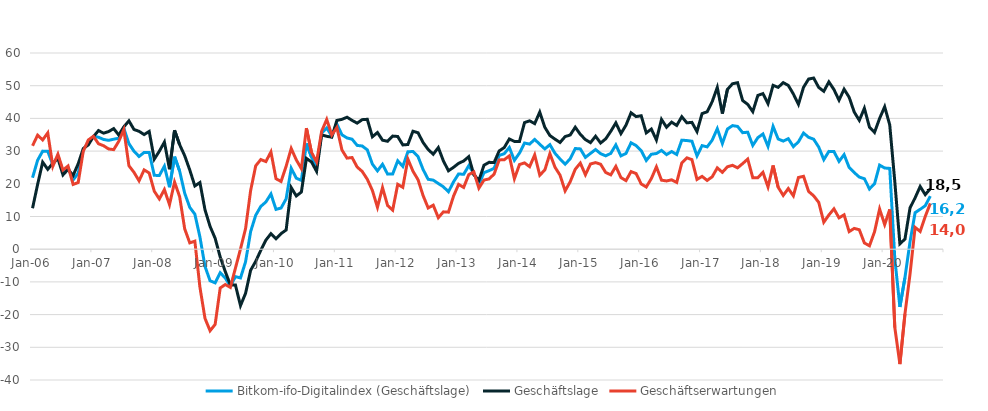
| Category | Bitkom-ifo-Digitalindex (Geschäftslage) | Geschäftslage | Geschäftserwartungen |
|---|---|---|---|
| 2006-01-01 | 21.86 | 12.52 | 31.62 |
| 2006-02-01 | 27.21 | 19.8 | 34.87 |
| 2006-03-01 | 29.99 | 26.62 | 33.42 |
| 2006-04-01 | 29.93 | 24.43 | 35.57 |
| 2006-05-01 | 25.82 | 26.28 | 25.37 |
| 2006-06-01 | 28.41 | 27.78 | 29.05 |
| 2006-07-01 | 23.46 | 22.72 | 24.2 |
| 2006-08-01 | 24.92 | 24.41 | 25.44 |
| 2006-09-01 | 21.18 | 22.55 | 19.81 |
| 2006-10-01 | 23.24 | 26.13 | 20.38 |
| 2006-11-01 | 30.38 | 30.78 | 29.97 |
| 2006-12-01 | 32.66 | 31.9 | 33.41 |
| 2007-01-01 | 34.48 | 34.43 | 34.53 |
| 2007-02-01 | 34.25 | 36.27 | 32.25 |
| 2007-03-01 | 33.56 | 35.49 | 31.65 |
| 2007-04-01 | 33.29 | 35.97 | 30.65 |
| 2007-05-01 | 33.64 | 36.88 | 30.45 |
| 2007-06-01 | 33.95 | 34.91 | 32.99 |
| 2007-07-01 | 37 | 37.42 | 36.57 |
| 2007-08-01 | 32.29 | 39.25 | 25.53 |
| 2007-09-01 | 29.96 | 36.61 | 23.51 |
| 2007-10-01 | 28.36 | 36.05 | 20.91 |
| 2007-11-01 | 29.59 | 35.06 | 24.25 |
| 2007-12-01 | 29.58 | 36.02 | 23.31 |
| 2008-01-01 | 22.59 | 27.53 | 17.75 |
| 2008-02-01 | 22.55 | 29.97 | 15.37 |
| 2008-03-01 | 25.39 | 32.76 | 18.25 |
| 2008-04-01 | 18.97 | 24.47 | 13.61 |
| 2008-05-01 | 28.3 | 36.35 | 20.52 |
| 2008-06-01 | 23.89 | 31.98 | 16.08 |
| 2008-07-01 | 17.11 | 28.58 | 6.21 |
| 2008-08-01 | 12.79 | 24.22 | 1.94 |
| 2008-09-01 | 10.72 | 19.34 | 2.45 |
| 2008-10-01 | 3.76 | 20.39 | -11.61 |
| 2008-11-01 | -5.25 | 12.06 | -21.15 |
| 2008-12-01 | -9.65 | 6.98 | -24.94 |
| 2009-01-01 | -10.29 | 3.34 | -23.01 |
| 2009-02-01 | -7.18 | -2.39 | -11.87 |
| 2009-03-01 | -8.83 | -6.84 | -10.8 |
| 2009-04-01 | -11.29 | -10.91 | -11.68 |
| 2009-05-01 | -8.39 | -10.94 | -5.8 |
| 2009-06-01 | -8.79 | -17.26 | 0.07 |
| 2009-07-01 | -3.85 | -13.49 | 6.29 |
| 2009-08-01 | 5.4 | -6.43 | 17.96 |
| 2009-09-01 | 10.38 | -3.71 | 25.49 |
| 2009-10-01 | 13.08 | -0.36 | 27.42 |
| 2009-11-01 | 14.44 | 2.77 | 26.79 |
| 2009-12-01 | 16.89 | 4.75 | 29.75 |
| 2010-01-01 | 12.18 | 3.21 | 21.55 |
| 2010-02-01 | 12.59 | 4.78 | 20.71 |
| 2010-03-01 | 15.41 | 5.87 | 25.39 |
| 2010-04-01 | 24.74 | 18.84 | 30.8 |
| 2010-05-01 | 21.73 | 16.28 | 27.32 |
| 2010-06-01 | 21.04 | 17.48 | 24.66 |
| 2010-07-01 | 32.34 | 27.77 | 37.01 |
| 2010-08-01 | 28.15 | 26.68 | 29.63 |
| 2010-09-01 | 25.25 | 23.81 | 26.7 |
| 2010-10-01 | 35.51 | 34.95 | 36.08 |
| 2010-11-01 | 37.09 | 34.53 | 39.68 |
| 2010-12-01 | 34.59 | 34.26 | 34.92 |
| 2011-01-01 | 38.29 | 39.38 | 37.2 |
| 2011-02-01 | 34.98 | 39.71 | 30.34 |
| 2011-03-01 | 34.02 | 40.36 | 27.85 |
| 2011-04-01 | 33.64 | 39.39 | 28.03 |
| 2011-05-01 | 31.74 | 38.55 | 25.13 |
| 2011-06-01 | 31.56 | 39.62 | 23.77 |
| 2011-07-01 | 30.38 | 39.72 | 21.39 |
| 2011-08-01 | 26.03 | 34.38 | 17.98 |
| 2011-09-01 | 23.96 | 35.68 | 12.82 |
| 2011-10-01 | 25.97 | 33.34 | 18.84 |
| 2011-11-01 | 22.96 | 33 | 13.36 |
| 2011-12-01 | 22.99 | 34.59 | 11.95 |
| 2012-01-01 | 27.03 | 34.47 | 19.84 |
| 2012-02-01 | 25.32 | 31.89 | 18.92 |
| 2012-03-01 | 29.78 | 32.02 | 27.56 |
| 2012-04-01 | 29.89 | 36.08 | 23.86 |
| 2012-05-01 | 28.32 | 35.61 | 21.25 |
| 2012-06-01 | 24.37 | 32.63 | 16.4 |
| 2012-07-01 | 21.37 | 30.49 | 12.61 |
| 2012-08-01 | 21.12 | 29.05 | 13.46 |
| 2012-09-01 | 20.1 | 31.08 | 9.64 |
| 2012-10-01 | 19.08 | 27.01 | 11.42 |
| 2012-11-01 | 17.57 | 23.98 | 11.33 |
| 2012-12-01 | 20.59 | 25.04 | 16.23 |
| 2013-01-01 | 23.02 | 26.26 | 19.82 |
| 2013-02-01 | 22.9 | 26.98 | 18.89 |
| 2013-03-01 | 25.53 | 28.3 | 22.8 |
| 2013-04-01 | 23.21 | 22.77 | 23.65 |
| 2013-05-01 | 19.87 | 21.07 | 18.67 |
| 2013-06-01 | 23.4 | 25.68 | 21.14 |
| 2013-07-01 | 24.01 | 26.56 | 21.49 |
| 2013-08-01 | 24.73 | 26.52 | 22.96 |
| 2013-09-01 | 28.67 | 30.06 | 27.3 |
| 2013-10-01 | 29.21 | 31.09 | 27.36 |
| 2013-11-01 | 31.11 | 33.71 | 28.54 |
| 2013-12-01 | 27.18 | 32.96 | 21.54 |
| 2014-01-01 | 29.39 | 32.96 | 25.88 |
| 2014-02-01 | 32.47 | 38.72 | 26.39 |
| 2014-03-01 | 32.14 | 39.26 | 25.24 |
| 2014-04-01 | 33.57 | 38.4 | 28.83 |
| 2014-05-01 | 32.09 | 41.94 | 22.63 |
| 2014-06-01 | 30.67 | 37.28 | 24.23 |
| 2014-07-01 | 31.97 | 34.76 | 29.21 |
| 2014-08-01 | 29.33 | 33.65 | 25.08 |
| 2014-09-01 | 27.59 | 32.64 | 22.64 |
| 2014-10-01 | 25.99 | 34.44 | 17.84 |
| 2014-11-01 | 27.66 | 34.92 | 20.62 |
| 2014-12-01 | 30.79 | 37.3 | 24.46 |
| 2015-01-01 | 30.67 | 35.11 | 26.33 |
| 2015-02-01 | 28.08 | 33.52 | 22.77 |
| 2015-03-01 | 29.3 | 32.59 | 26.06 |
| 2015-04-01 | 30.48 | 34.54 | 26.48 |
| 2015-05-01 | 29.21 | 32.48 | 25.98 |
| 2015-06-01 | 28.55 | 33.75 | 23.46 |
| 2015-07-01 | 29.3 | 36.05 | 22.74 |
| 2015-08-01 | 31.89 | 38.63 | 25.33 |
| 2015-09-01 | 28.54 | 35.36 | 21.91 |
| 2015-10-01 | 29.29 | 37.93 | 20.97 |
| 2015-11-01 | 32.54 | 41.71 | 23.73 |
| 2015-12-01 | 31.69 | 40.56 | 23.14 |
| 2016-01-01 | 30.15 | 40.82 | 19.95 |
| 2016-02-01 | 27.15 | 35.57 | 19.02 |
| 2016-03-01 | 29.04 | 36.74 | 21.6 |
| 2016-04-01 | 29.26 | 33.4 | 25.19 |
| 2016-05-01 | 30.21 | 39.69 | 21.11 |
| 2016-06-01 | 28.93 | 37.28 | 20.87 |
| 2016-07-01 | 29.87 | 38.86 | 21.22 |
| 2016-08-01 | 28.96 | 37.84 | 20.41 |
| 2016-09-01 | 33.34 | 40.52 | 26.37 |
| 2016-10-01 | 33.23 | 38.64 | 27.94 |
| 2016-11-01 | 33.02 | 38.79 | 27.4 |
| 2016-12-01 | 28.54 | 35.97 | 21.33 |
| 2017-01-01 | 31.68 | 41.47 | 22.27 |
| 2017-02-01 | 31.29 | 42.02 | 21.03 |
| 2017-03-01 | 33.36 | 45.14 | 22.15 |
| 2017-04-01 | 36.86 | 49.48 | 24.87 |
| 2017-05-01 | 32.32 | 41.47 | 23.51 |
| 2017-06-01 | 36.74 | 48.87 | 25.21 |
| 2017-07-01 | 37.79 | 50.59 | 25.65 |
| 2017-08-01 | 37.55 | 50.92 | 24.89 |
| 2017-09-01 | 35.63 | 45.47 | 26.18 |
| 2017-10-01 | 35.78 | 44.3 | 27.56 |
| 2017-11-01 | 31.74 | 42.06 | 21.86 |
| 2017-12-01 | 34.11 | 47.03 | 21.87 |
| 2018-01-01 | 35.24 | 47.58 | 23.51 |
| 2018-02-01 | 31.44 | 44.52 | 19.05 |
| 2018-03-01 | 37.55 | 50.11 | 25.61 |
| 2018-04-01 | 33.71 | 49.49 | 18.94 |
| 2018-05-01 | 33.06 | 50.94 | 16.45 |
| 2018-06-01 | 33.79 | 50.09 | 18.55 |
| 2018-07-01 | 31.37 | 47.47 | 16.32 |
| 2018-08-01 | 32.84 | 44.3 | 21.93 |
| 2018-09-01 | 35.52 | 49.51 | 22.3 |
| 2018-10-01 | 34.22 | 52.03 | 17.67 |
| 2018-11-01 | 33.64 | 52.34 | 16.33 |
| 2018-12-01 | 31.23 | 49.47 | 14.32 |
| 2019-01-01 | 27.39 | 48.29 | 8.26 |
| 2019-02-01 | 29.91 | 51.17 | 10.46 |
| 2019-03-01 | 29.86 | 48.82 | 12.35 |
| 2019-04-01 | 26.86 | 45.57 | 9.58 |
| 2019-05-01 | 28.92 | 48.94 | 10.51 |
| 2019-06-01 | 24.98 | 46.46 | 5.38 |
| 2019-07-01 | 23.44 | 41.94 | 6.36 |
| 2019-08-01 | 22.05 | 39.41 | 5.95 |
| 2019-09-01 | 21.55 | 43.1 | 1.91 |
| 2019-10-01 | 18.43 | 37.33 | 1.04 |
| 2019-11-01 | 19.99 | 35.72 | 5.31 |
| 2019-12-01 | 25.72 | 39.99 | 12.29 |
| 2020-01-01 | 24.83 | 43.56 | 7.54 |
| 2020-02-01 | 24.71 | 38.01 | 12.15 |
| 2020-03-01 | -2.92 | 20.63 | -23.96 |
| 2020-04-01 | -17.66 | 1.65 | -35.13 |
| 2020-05-01 | -8.68 | 3.1 | -19.79 |
| 2020-06-01 | 2.28 | 12.63 | -7.58 |
| 2020-07-01 | 11.15 | 15.71 | 6.68 |
| 2020-08-01 | 12.18 | 19.17 | 5.41 |
| 2020-09-01 | 13.32 | 16.69 | 10 |
| 2020-10-01 | 16.24 | 18.49 | 14.02 |